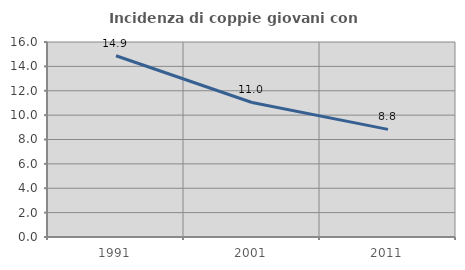
| Category | Incidenza di coppie giovani con figli |
|---|---|
| 1991.0 | 14.871 |
| 2001.0 | 11.036 |
| 2011.0 | 8.83 |